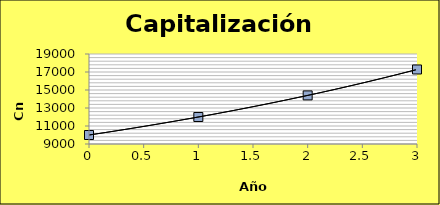
| Category | Capitalización Compuesta |
|---|---|
| 0.0 | 10000 |
| 1.0 | 12000 |
| 2.0 | 14400 |
| 3.0 | 17280 |